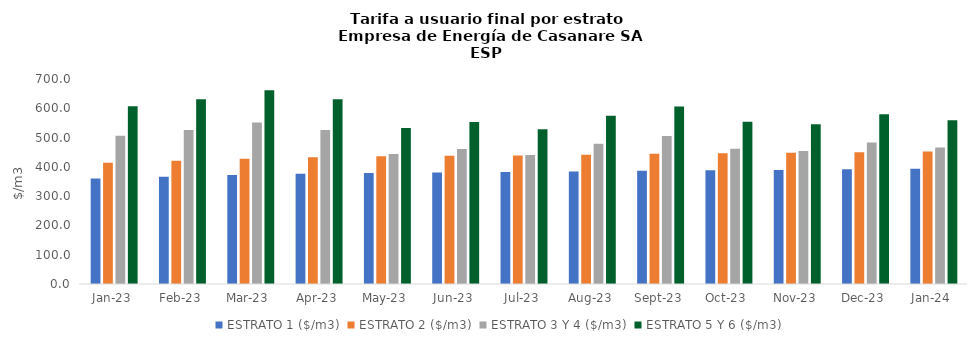
| Category | ESTRATO 1 ($/m3) | ESTRATO 2 ($/m3) | ESTRATO 3 Y 4 ($/m3) | ESTRATO 5 Y 6 ($/m3) |
|---|---|---|---|---|
| 2023-01-01 | 359.93 | 413.65 | 505.984 | 607.18 |
| 2023-02-01 | 366.33 | 421 | 525.703 | 630.843 |
| 2023-03-01 | 372.41 | 428 | 551.417 | 661.7 |
| 2023-04-01 | 376.32 | 432.49 | 525.703 | 630.843 |
| 2023-05-01 | 379.26 | 435.87 | 444.034 | 532.841 |
| 2023-06-01 | 380.92 | 437.78 | 460.92 | 553.104 |
| 2023-07-01 | 382.06 | 439.09 | 440.108 | 528.13 |
| 2023-08-01 | 383.97 | 441.29 | 479.093 | 574.912 |
| 2023-09-01 | 386.66 | 444.37 | 505.302 | 606.362 |
| 2023-10-01 | 388.72 | 446.74 | 461.695 | 554.034 |
| 2023-11-01 | 389.69 | 447.85 | 454.34 | 545.208 |
| 2023-12-01 | 391.51 | 449.95 | 483.31 | 579.972 |
| 2024-01-01 | 393.31 | 452.02 | 465.872 | 559.047 |